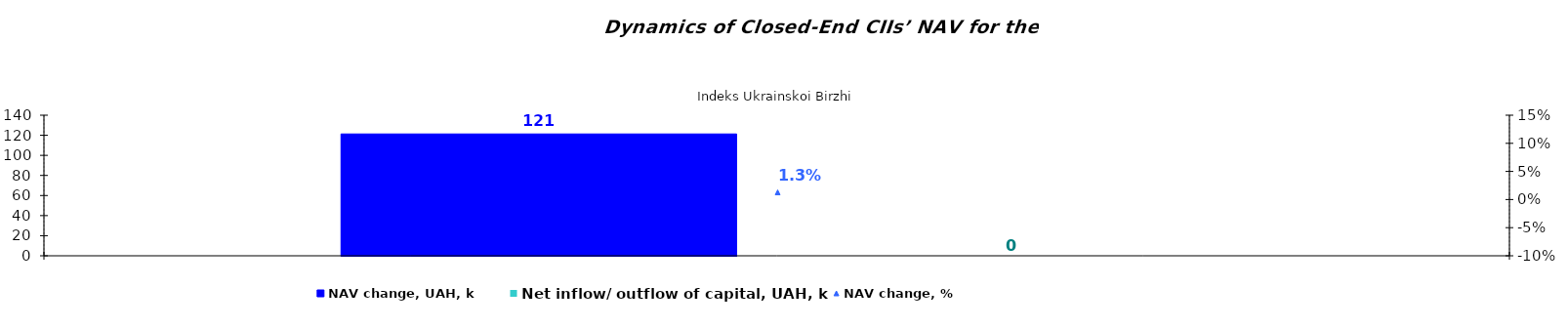
| Category | NAV change, UAH, k | Net inflow/ outflow of capital, UAH, k |
|---|---|---|
| Іndeks Ukrainskoi Birzhi | 121.328 | 0 |